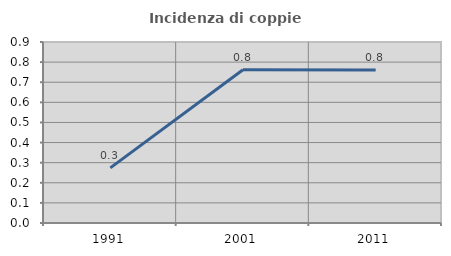
| Category | Incidenza di coppie miste |
|---|---|
| 1991.0 | 0.274 |
| 2001.0 | 0.762 |
| 2011.0 | 0.76 |